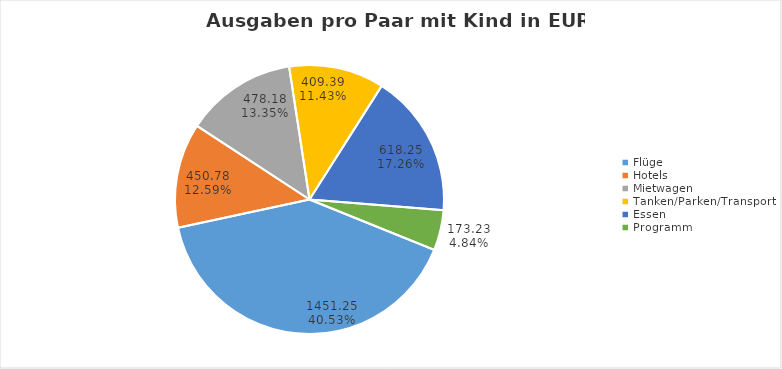
| Category | Series 0 |
|---|---|
| Flüge | 1451.25 |
| Hotels | 450.78 |
| Mietwagen | 478.18 |
| Tanken/Parken/Transport | 409.389 |
| Essen | 618.248 |
| Programm | 173.229 |